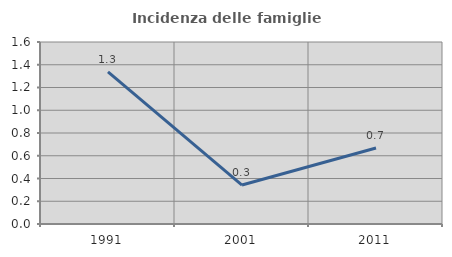
| Category | Incidenza delle famiglie numerose |
|---|---|
| 1991.0 | 1.338 |
| 2001.0 | 0.342 |
| 2011.0 | 0.668 |